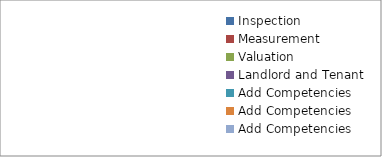
| Category | Series 0 |
|---|---|
| Inspection | 0 |
| Measurement | 0 |
| Valuation | 0 |
| Landlord and Tenant | 0 |
| Add Competencies | 0 |
| Add Competencies | 0 |
| Add Competencies | 0 |